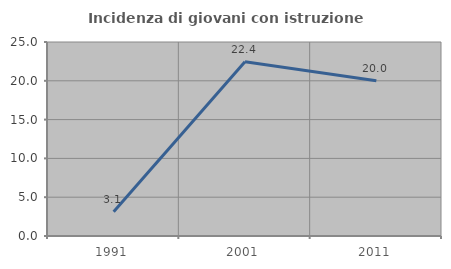
| Category | Incidenza di giovani con istruzione universitaria |
|---|---|
| 1991.0 | 3.125 |
| 2001.0 | 22.449 |
| 2011.0 | 20 |